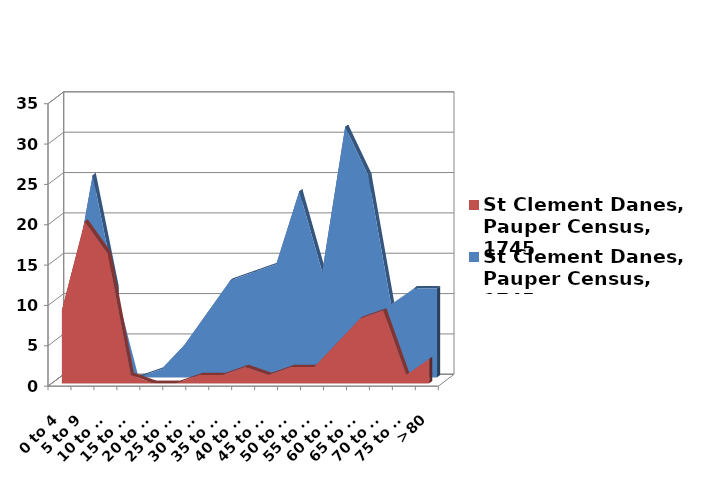
| Category | St Clement Danes, Pauper Census, 1745 |
|---|---|
| 0 to 4 | 9 |
| 5 to 9 | 25 |
| 10 to 14 | 11 |
| 15 to 19 | 0 |
| 20 to 24 | 1 |
| 25 to 29 | 4 |
| 30 to 34 | 8 |
| 35 to 39 | 12 |
| 40 to 44 | 13 |
| 45 to 49 | 14 |
| 50 to 54 | 23 |
| 55 to 59 | 13 |
| 60 to 64 | 31 |
| 65 to 69 | 25 |
| 70 to 74 | 9 |
| 75 to 79 | 11 |
| >80 | 11 |